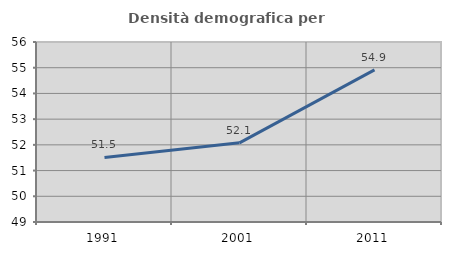
| Category | Densità demografica |
|---|---|
| 1991.0 | 51.512 |
| 2001.0 | 52.079 |
| 2011.0 | 54.913 |